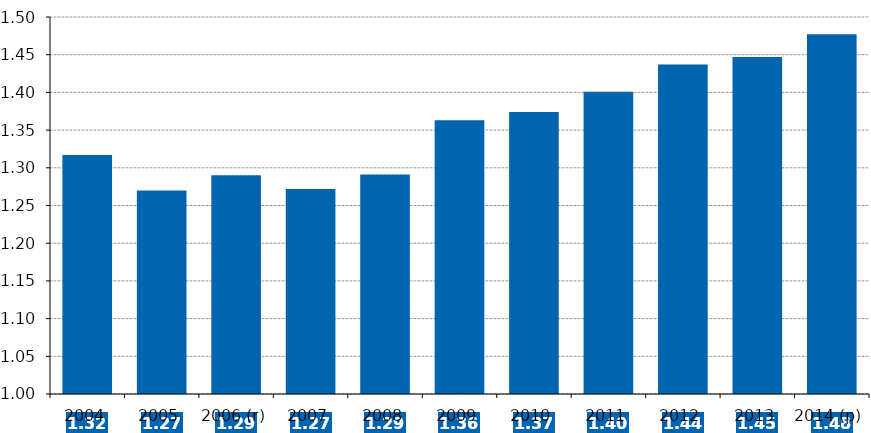
| Category | Dépenses intérieures de R&D des entreprises  |
|---|---|
| 2004 | 1.317 |
| 2005 | 1.27 |
| 2006 (r) | 1.29 |
| 2007 | 1.272 |
| 2008 | 1.291 |
| 2009 | 1.363 |
| 2010 | 1.374 |
| 2011 | 1.401 |
| 2012 | 1.437 |
| 2013 | 1.447 |
| 2014 (p) | 1.477 |